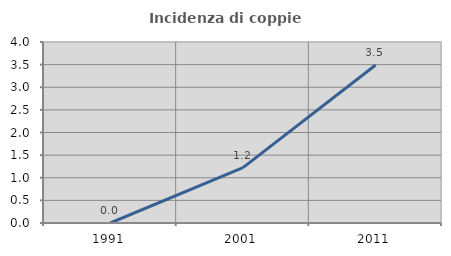
| Category | Incidenza di coppie miste |
|---|---|
| 1991.0 | 0 |
| 2001.0 | 1.224 |
| 2011.0 | 3.492 |